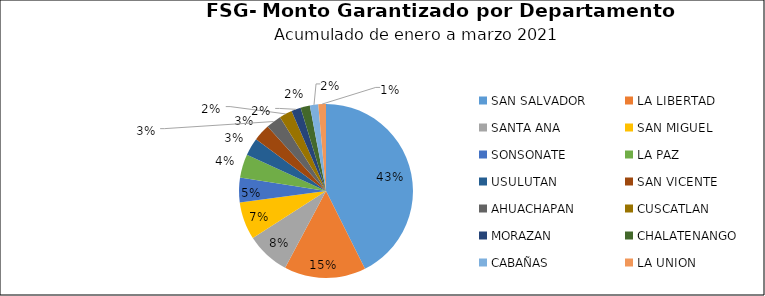
| Category | Monto | Créditos |
|---|---|---|
| SAN SALVADOR | 5.9 | 773 |
| LA LIBERTAD | 2.101 | 292 |
| SANTA ANA | 1.124 | 213 |
| SAN MIGUEL | 0.969 | 213 |
| SONSONATE | 0.634 | 130 |
| LA PAZ | 0.605 | 207 |
| USULUTAN | 0.455 | 159 |
| SAN VICENTE | 0.438 | 116 |
| AHUACHAPAN | 0.394 | 133 |
| CUSCATLAN | 0.33 | 155 |
| MORAZAN | 0.244 | 91 |
| CHALATENANGO | 0.24 | 90 |
| CABAÑAS | 0.216 | 65 |
| LA UNION | 0.197 | 77 |